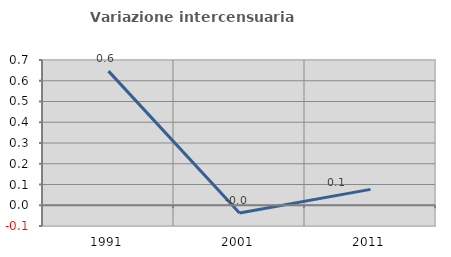
| Category | Variazione intercensuaria annua |
|---|---|
| 1991.0 | 0.646 |
| 2001.0 | -0.037 |
| 2011.0 | 0.077 |